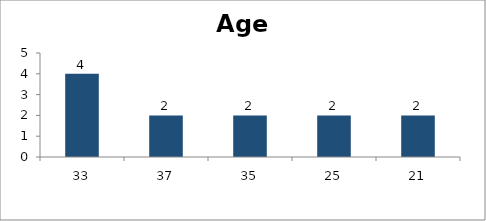
| Category | Age |
|---|---|
| 33.0 | 4 |
| 37.0 | 2 |
| 35.0 | 2 |
| 25.0 | 2 |
| 21.0 | 2 |